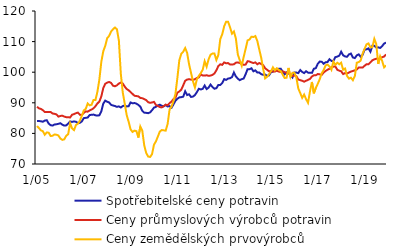
| Category | Spotřebitelské ceny potravin | Ceny průmyslových výrobců potravin | Ceny zemědělských prvovýrobců  |
|---|---|---|---|
|  1/05 | 84.027 | 88.7 | 82.407 |
| 2 | 84.043 | 88.2 | 81.738 |
| 3 | 83.963 | 88 | 80.985 |
| 4 | 83.812 | 87.6 | 80.734 |
| 5 | 84.18 | 87 | 79.563 |
| 6 | 84.316 | 87 | 80.316 |
| 7 | 83.218 | 87 | 80.232 |
| 8 | 82.688 | 87 | 79.145 |
| 9 | 82.556 | 86.5 | 79.228 |
| 10 | 82.912 | 86.4 | 79.646 |
| 11 | 82.977 | 86.2 | 79.563 |
| 12 | 83.127 | 85.5 | 79.312 |
|  1/06 | 83.334 | 85.7 | 78.308 |
| 2 | 82.857 | 85.8 | 77.89 |
| 3 | 82.55 | 85.5 | 78.057 |
| 4 | 82.622 | 85.3 | 79.228 |
| 5 | 83.218 | 85.3 | 79.73 |
| 6 | 83.893 | 85.2 | 83.328 |
| 7 | 83.758 | 86.1 | 81.654 |
| 8 | 83.914 | 86.3 | 81.069 |
| 9 | 83.805 | 86.6 | 82.742 |
| 10 | 83.373 | 86.8 | 83.16 |
| 11 | 83.451 | 86.1 | 84.164 |
| 12 | 83.935 | 86 | 85.754 |
|  1/07 | 84.993 | 86.7 | 87.511 |
| 2 | 85.083 | 87.2 | 88.013 |
| 3 | 85.184 | 87.1 | 89.77 |
| 4 | 85.991 | 87.5 | 89.184 |
| 5 | 86.087 | 87.8 | 89.351 |
| 6 | 86.149 | 88.2 | 90.941 |
| 7 | 85.906 | 88.9 | 90.941 |
| 8 | 85.825 | 89.8 | 93.618 |
| 9 | 85.934 | 90.4 | 97.634 |
| 10 | 87.239 | 92.1 | 103.407 |
| 11 | 89.719 | 94.8 | 106.837 |
| 12 | 90.719 | 96.2 | 108.594 |
|  1/08 | 90.343 | 96.6 | 111.104 |
| 2 | 90.119 | 96.8 | 111.856 |
| 3 | 89.325 | 96.5 | 113.279 |
| 4 | 89.119 | 95.6 | 114.032 |
| 5 | 88.946 | 95.4 | 114.617 |
| 6 | 88.671 | 95.7 | 114.032 |
| 7 | 88.822 | 96.3 | 110.351 |
| 8 | 88.472 | 96.6 | 99.474 |
| 9 | 88.927 | 96.3 | 93.367 |
| 10 | 89.144 | 95.3 | 89.77 |
| 11 | 88.818 | 94.5 | 86.005 |
| 12 | 88.862 | 94.1 | 83.83 |
|  1/09 | 90.112 | 93.5 | 81.32 |
| 2 | 89.838 | 92.9 | 80.483 |
| 3 | 89.927 | 92.3 | 80.901 |
| 4 | 89.721 | 92.2 | 80.734 |
| 5 | 89.308 | 92.1 | 78.643 |
| 6 | 88.743 | 91.6 | 82.24 |
| 7 | 87.37 | 91.5 | 80.901 |
| 8 | 86.793 | 91.2 | 76.133 |
| 9 | 86.721 | 90.9 | 73.623 |
| 10 | 86.607 | 90.2 | 72.452 |
| 11 | 86.859 | 90 | 72.284 |
| 12 | 87.567 | 90.1 | 73.204 |
|  1/10 | 88.414 | 90.3 | 76.3 |
| 2 | 88.681 | 89.3 | 77.4 |
| 3 | 89.115 | 89 | 79 |
| 4 | 89.374 | 88.6 | 80.6 |
| 5 | 89.032 | 88.5 | 81.1 |
| 6 | 88.856 | 88.9 | 81 |
| 7 | 89.292 | 89.4 | 80.9 |
| 8 | 88.807 | 89.2 | 83.1 |
| 9 | 88.925 | 89.9 | 87.8 |
| 10 | 88.404 | 90.4 | 88.8 |
| 11 | 89.494 | 91.2 | 90.5 |
| 12 | 90.663 | 91.7 | 92.9 |
|  1/11 | 91.34 | 93.3 | 98.1 |
| 2 | 91.773 | 93.7 | 103.9 |
| 3 | 91.842 | 94.3 | 106 |
| 4 | 92.001 | 95.7 | 106.7 |
| 5 | 93.752 | 97.2 | 107.9 |
| 6 | 92.549 | 97.6 | 106.3 |
| 7 | 92.776 | 97.7 | 102.6 |
| 8 | 91.918 | 97.6 | 99.8 |
| 9 | 92.038 | 97.5 | 97 |
| 10 | 92.52 | 97.7 | 95 |
| 11 | 93.491 | 98.1 | 97.7 |
| 12 | 94.575 | 98.3 | 98.8 |
|  1/12 | 94.365 | 99.3 | 99.7 |
| 2 | 94.559 | 98.9 | 100.8 |
| 3 | 95.635 | 98.9 | 103.6 |
| 4 | 94.487 | 99 | 101.8 |
| 5 | 94.958 | 98.8 | 104.2 |
| 6 | 95.961 | 98.9 | 105.7 |
| 7 | 95.145 | 99.1 | 106.1 |
| 8 | 94.601 | 99.6 | 106.1 |
| 9 | 94.768 | 100.6 | 104 |
| 10 | 95.825 | 102 | 105.6 |
| 11 | 95.834 | 102.6 | 110.8 |
| 12 | 96.481 | 102.4 | 112.4 |
|  1/13 | 97.745 | 103.2 | 115 |
| 2 | 97.482 | 102.9 | 116.5 |
| 3 | 97.925 | 103 | 116.5 |
| 4 | 98.039 | 102.5 | 114.7 |
| 5 | 98.378 | 102.5 | 112.6 |
| 6 | 99.913 | 102.6 | 113.3 |
| 7 | 98.624 | 103.1 | 111 |
| 8 | 97.889 | 103.2 | 105.8 |
| 9 | 97.395 | 103 | 103.9 |
| 10 | 97.719 | 102.7 | 102.1 |
| 11 | 97.931 | 102.4 | 105 |
| 12 | 99.347 | 102.5 | 107.6 |
|  1/14 | 101 | 103.6 | 110.4 |
| 2 | 100.99 | 103.5 | 110.7 |
| 3 | 101.273 | 103.2 | 111.6 |
| 4 | 100.292 | 103 | 111.5 |
| 5 | 100.602 | 103.2 | 111.8 |
| 6 | 99.89 | 102.6 | 110.2 |
| 7 | 99.893 | 103 | 107.4 |
| 8 | 99.358 | 102.7 | 104.7 |
| 9 | 99.138 | 102.3 | 101.1 |
| 10 | 99.241 | 101.3 | 98 |
| 11 | 98.82 | 100.8 | 98.5 |
| 12 | 98.956 | 100.3 | 99.3 |
|  1/15 | 99.984 | 100.4 | 100.3 |
| 2 | 100.212 | 100.2 | 101.6 |
| 3 | 100.465 | 100.2 | 100.6 |
| 4 | 100.727 | 100.5 | 101.3 |
| 5 | 101.133 | 100.2 | 100.7 |
| 6 | 101.14 | 100.1 | 100.4 |
| 7 | 100.119 | 100.3 | 99.2 |
| 8 | 99.307 | 100 | 98.1 |
| 9 | 99.965 | 99.8 | 98.2 |
| 10 | 99.743 | 99.7 | 101.4 |
| 11 | 98.932 | 99.3 | 98.4 |
| 12 | 98.273 | 98.8 | 99.8 |
|  1/16 | 99.922 | 98.9 | 99.8 |
| 2 | 99.892 | 98.7 | 98.3 |
| 3 | 99.699 | 97.6 | 94.7 |
| 4 | 100.695 | 97.4 | 93.2 |
| 5 | 100.069 | 97.2 | 91.6 |
| 6 | 99.727 | 96.9 | 92.7 |
| 7 | 100.316 | 97.2 | 91.2 |
| 8 | 99.858 | 97.5 | 90 |
| 9 | 99.833 | 97.8 | 93.7 |
| 10 | 99.781 | 98.6 | 96.8 |
| 11 | 101.129 | 99 | 93.1 |
| 12 | 101.331 | 99 | 94.9 |
|  1/17 | 102.756 | 99.4 | 96.2 |
| 2 | 103.464 | 99.3 | 97.7 |
| 3 | 103.443 | 99.1 | 99.6 |
| 4 | 102.756 | 99.9 | 100.7 |
| 5 | 103.242 | 100.4 | 102.2 |
| 6 | 103.324 | 100.8 | 102.5 |
| 7 | 104.243 | 101.1 | 101.9 |
| 8 | 103.691 | 101.6 | 100.8 |
| 9 | 103.707 | 101.8 | 103.5 |
| 10 | 104.909 | 101.9 | 102.4 |
| 11 | 105.103 | 100.8 | 103.1 |
| 12 | 105.395 | 100.5 | 102.6 |
|  1/18 | 106.681 | 100.3 | 103.1 |
| 2 | 105.529 | 99.4 | 100.8 |
| 3 | 105.152 | 99.7 | 101.2 |
| 4 | 105.034 | 99.6 | 98.8 |
| 5 | 105.816 | 99.9 | 97.9 |
| 6 | 106.084 | 100.2 | 98.2 |
| 7 | 104.836 | 100.4 | 97.4 |
| 8 | 104.605 | 100.6 | 98.7 |
| 9 | 105.491 | 100.9 | 103.1 |
| 10 | 105.819 | 101.5 | 103.3 |
| 11 | 105.031 | 101.5 | 103.8 |
| 12 | 105.673 | 101.5 | 106.1 |
|  1/19 | 107.384 | 102.1 | 107.6 |
| 2 | 107.481 | 102.6 | 109.1 |
| 3 | 107.792 | 102.6 | 109.4 |
| 4 | 106.695 | 103.2 | 108.1 |
| 5 | 108.658 | 103.9 | 108.2 |
| 6 | 108.613 | 104.2 | 110.9 |
| 7 | 108.086 | 104.4 | 109.2 |
| 8 | 108.115 | 104.3 | 102.7 |
| 9 | 107.93 | 104.5 | 105.2 |
| 10 | 108.52 | 104.9 | 103.7 |
| 11 | 109.331 | 105.1 | 101.6 |
| 12 | 109.673 | 105.8 | 102.2 |